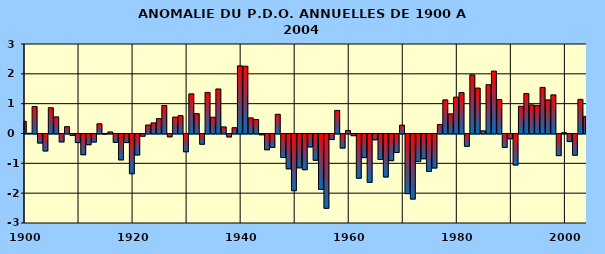
| Category | PDO |
|---|---|
| 1900.0 | 0.408 |
| 1901.0 | 0.008 |
| 1902.0 | 0.906 |
| 1903.0 | -0.303 |
| 1904.0 | -0.568 |
| 1905.0 | 0.864 |
| 1906.0 | 0.558 |
| 1907.0 | -0.265 |
| 1908.0 | 0.229 |
| 1909.0 | -0.048 |
| 1910.0 | -0.287 |
| 1911.0 | -0.696 |
| 1912.0 | -0.359 |
| 1913.0 | -0.269 |
| 1914.0 | 0.326 |
| 1915.0 | -0.007 |
| 1916.0 | 0.053 |
| 1917.0 | -0.281 |
| 1918.0 | -0.868 |
| 1919.0 | -0.287 |
| 1920.0 | -1.331 |
| 1921.0 | -0.703 |
| 1922.0 | -0.074 |
| 1923.0 | 0.285 |
| 1924.0 | 0.356 |
| 1925.0 | 0.498 |
| 1926.0 | 0.939 |
| 1927.0 | -0.093 |
| 1928.0 | 0.55 |
| 1929.0 | 0.599 |
| 1930.0 | -0.595 |
| 1931.0 | 1.329 |
| 1932.0 | 0.667 |
| 1933.0 | -0.343 |
| 1934.0 | 1.377 |
| 1935.0 | 0.547 |
| 1936.0 | 1.493 |
| 1937.0 | 0.221 |
| 1938.0 | -0.096 |
| 1939.0 | 0.195 |
| 1940.0 | 2.267 |
| 1941.0 | 2.256 |
| 1942.0 | 0.524 |
| 1943.0 | 0.468 |
| 1944.0 | -0.026 |
| 1945.0 | -0.528 |
| 1946.0 | -0.452 |
| 1947.0 | 0.644 |
| 1948.0 | -0.789 |
| 1949.0 | -1.167 |
| 1950.0 | -1.9 |
| 1951.0 | -1.134 |
| 1952.0 | -1.196 |
| 1953.0 | -0.433 |
| 1954.0 | -0.882 |
| 1955.0 | -1.855 |
| 1956.0 | -2.492 |
| 1957.0 | -0.186 |
| 1958.0 | 0.774 |
| 1959.0 | -0.471 |
| 1960.0 | 0.101 |
| 1961.0 | -0.056 |
| 1962.0 | -1.482 |
| 1963.0 | -0.792 |
| 1964.0 | -1.62 |
| 1965.0 | -0.194 |
| 1966.0 | -0.853 |
| 1967.0 | -1.44 |
| 1968.0 | -0.893 |
| 1969.0 | -0.621 |
| 1970.0 | 0.281 |
| 1971.0 | -1.998 |
| 1972.0 | -2.181 |
| 1973.0 | -0.924 |
| 1974.0 | -0.83 |
| 1975.0 | -1.252 |
| 1976.0 | -1.14 |
| 1977.0 | 0.303 |
| 1978.0 | 1.127 |
| 1979.0 | 0.659 |
| 1980.0 | 1.22 |
| 1981.0 | 1.374 |
| 1982.0 | -0.411 |
| 1983.0 | 1.969 |
| 1984.0 | 1.523 |
| 1985.0 | 0.09 |
| 1986.0 | 1.635 |
| 1987.0 | 2.092 |
| 1988.0 | 1.138 |
| 1989.0 | -0.449 |
| 1990.0 | -0.16 |
| 1991.0 | -1.039 |
| 1992.0 | 0.914 |
| 1993.0 | 1.34 |
| 1994.0 | 0.958 |
| 1995.0 | 0.943 |
| 1996.0 | 1.546 |
| 1997.0 | 1.127 |
| 1998.0 | 1.295 |
| 1999.0 | -0.725 |
| 2000.0 | 0.027 |
| 2001.0 | -0.254 |
| 2002.0 | -0.71 |
| 2003.0 | 1.145 |
| 2004.0 | 0.576 |